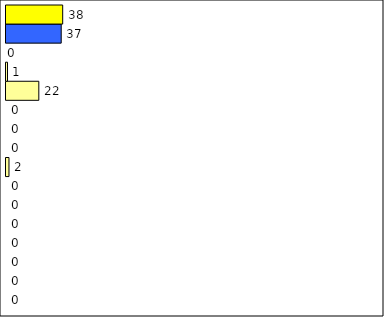
| Category | -2 | -1 | 0 | 1 | 2 | 3 | 4 | 5 | 6 | 7 | 8 | 9 | 10 | 11 | 12 | Perfect Round |
|---|---|---|---|---|---|---|---|---|---|---|---|---|---|---|---|---|
| 0 | 0 | 0 | 0 | 0 | 0 | 0 | 0 | 2 | 0 | 0 | 0 | 22 | 1 | 0 | 37 | 38 |